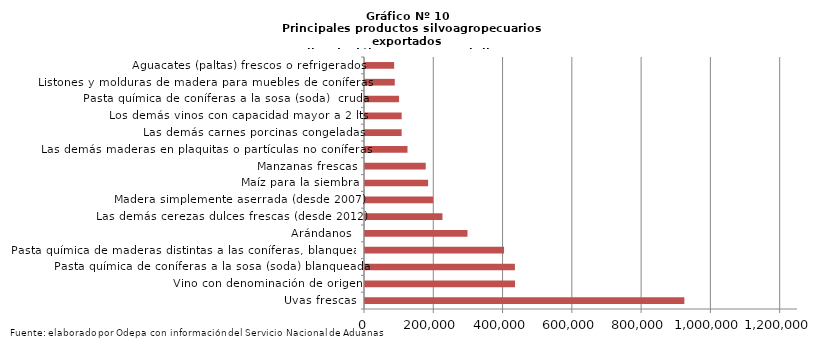
| Category | Series 0 |
|---|---|
| Uvas frescas | 921935.015 |
| Vino con denominación de origen | 433137.269 |
| Pasta química de coníferas a la sosa (soda) blanqueada | 432819.575 |
| Pasta química de maderas distintas a las coníferas, blanqueada | 401328.666 |
| Arándanos  | 295892.029 |
| Las demás cerezas dulces frescas (desde 2012) | 223647.944 |
| Madera simplemente aserrada (desde 2007) | 196560.893 |
| Maíz para la siembra | 182180.649 |
| Manzanas frescas | 175363.514 |
| Las demás maderas en plaquitas o partículas no coníferas | 122675.624 |
| Las demás carnes porcinas congeladas | 105800.981 |
| Los demás vinos con capacidad mayor a 2 lts | 105766.802 |
| Pasta química de coníferas a la sosa (soda)  cruda | 98366.896 |
| Listones y molduras de madera para muebles de coníferas | 85971.657 |
| Aguacates (paltas) frescos o refrigerados | 84097.078 |